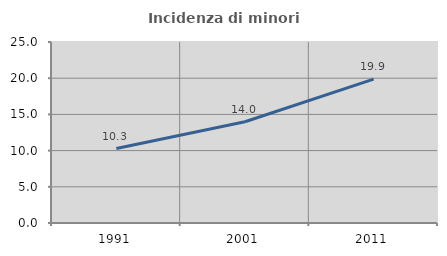
| Category | Incidenza di minori stranieri |
|---|---|
| 1991.0 | 10.28 |
| 2001.0 | 13.989 |
| 2011.0 | 19.871 |